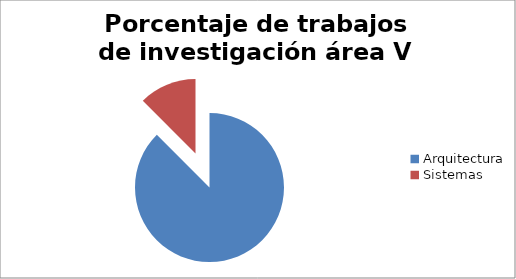
| Category | Nº |
|---|---|
| Arquitectura | 7 |
| Sistemas | 1 |